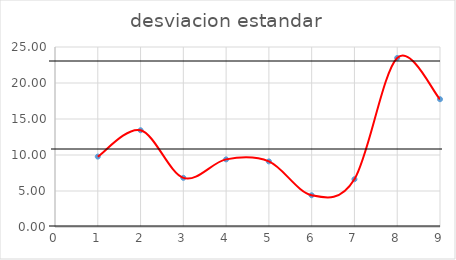
| Category | Series 0 |
|---|---|
| 0 | 9.778 |
| 1 | 13.437 |
| 2 | 6.829 |
| 3 | 9.394 |
| 4 | 9.108 |
| 5 | 4.409 |
| 6 | 6.633 |
| 7 | 23.483 |
| 8 | 17.747 |